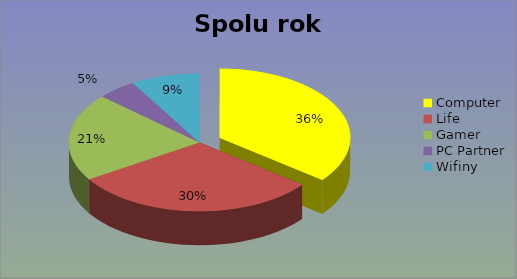
| Category | Spolu rok 2017 |
|---|---|
| Computer | 14026 |
| Life | 11990 |
| Gamer | 8159 |
| PC Partner | 1913 |
| Wifiny | 3354 |